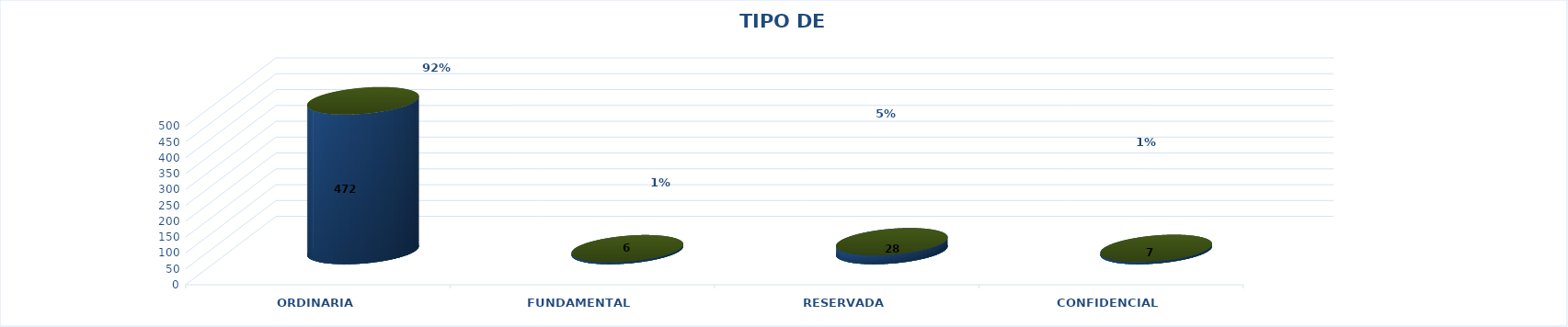
| Category | Series 0 | Series 2 | Series 1 | Series 3 | Series 4 |
|---|---|---|---|---|---|
| ORDINARIA |  |  |  | 472 | 0.92 |
| FUNDAMENTAL |  |  |  | 6 | 0.012 |
| RESERVADA |  |  |  | 28 | 0.055 |
| CONFIDENCIAL |  |  |  | 7 | 0.014 |